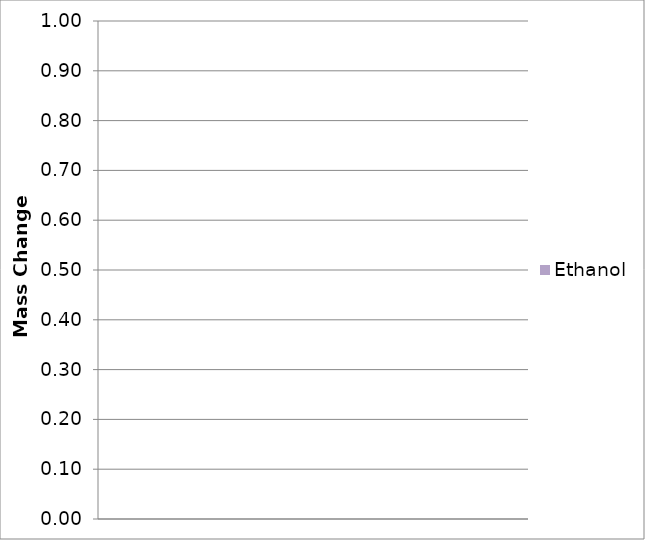
| Category | Ethanol |
|---|---|
| 0 | 0 |